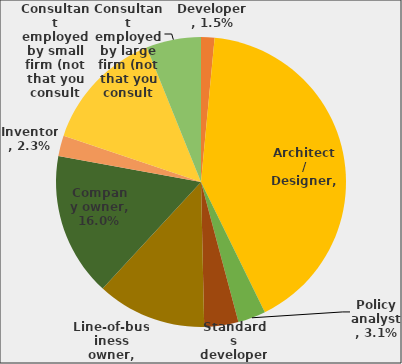
| Category | Series 0 |
|---|---|
| Developer | 0.015 |
| Architect / Designer | 0.412 |
| Policy analyst | 0.031 |
| Standards developer | 0.038 |
| Line-of-business owner | 0.122 |
| Company owner | 0.16 |
| Inventor | 0.023 |
| Consultant employed by small firm (not that you consult to) | 0.137 |
| Consultant employed by large firm (not that you consult to) | 0.061 |